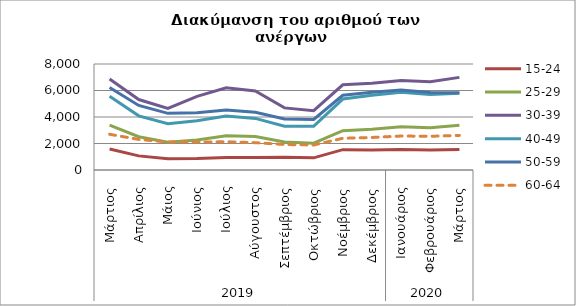
| Category | 15-24 | 25-29 | 30-39 | 40-49 | 50-59 | 60-64 |
|---|---|---|---|---|---|---|
| 0 | 1583 | 3382 | 6867 | 5573 | 6230 | 2696 |
| 1 | 1065 | 2512 | 5317 | 4088 | 4875 | 2307 |
| 2 | 855 | 2089 | 4649 | 3486 | 4277 | 2115 |
| 3 | 865 | 2260 | 5554 | 3710 | 4325 | 2110 |
| 4 | 937 | 2588 | 6199 | 4067 | 4524 | 2132 |
| 5 | 950 | 2528 | 5962 | 3895 | 4356 | 2062 |
| 6 | 960 | 2109 | 4687 | 3310 | 3846 | 1924 |
| 7 | 919 | 2022 | 4478 | 3293 | 3811 | 1886 |
| 8 | 1537 | 2970 | 6427 | 5355 | 5640 | 2393 |
| 9 | 1503 | 3082 | 6550 | 5646 | 5873 | 2456 |
| 10 | 1553 | 3257 | 6759 | 5874 | 6042 | 2564 |
| 11 | 1509 | 3191 | 6656 | 5700 | 5841 | 2544 |
| 12 | 1555 | 3375 | 6990 | 5790 | 5839 | 2611 |